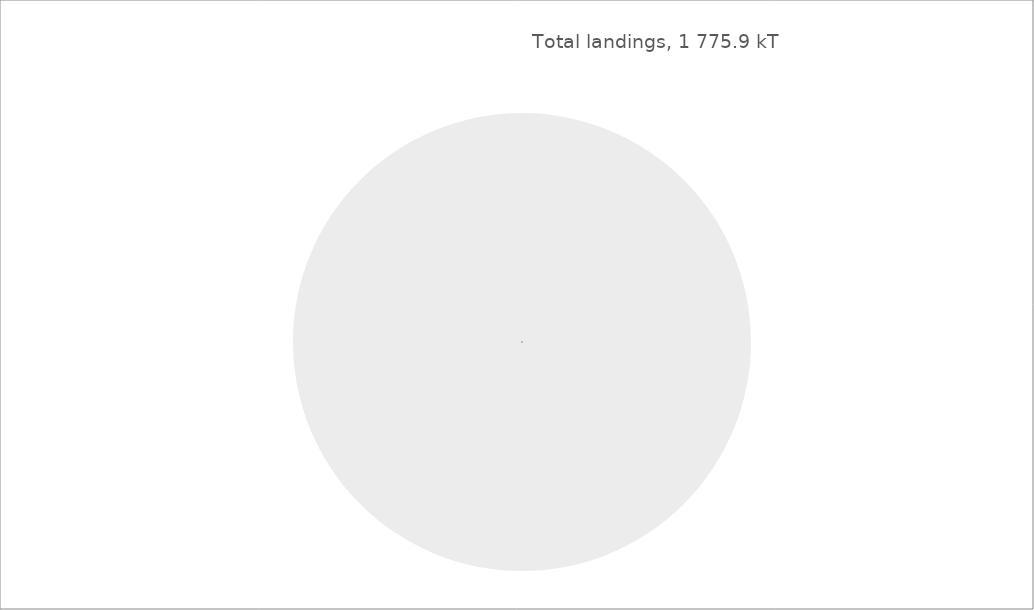
| Category | Widely | Total landings (kT)** |
|---|---|---|
| 0 | 11332.622 | 1775.868 |